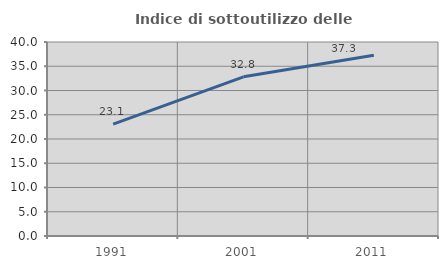
| Category | Indice di sottoutilizzo delle abitazioni  |
|---|---|
| 1991.0 | 23.067 |
| 2001.0 | 32.817 |
| 2011.0 | 37.285 |